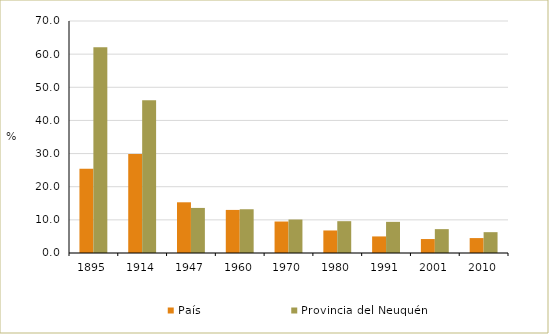
| Category | País | Provincia del Neuquén |
|---|---|---|
| 1895.0 | 25.4 | 62.1 |
| 1914.0 | 29.9 | 46.1 |
| 1947.0 | 15.3 | 13.6 |
| 1960.0 | 13 | 13.2 |
| 1970.0 | 9.5 | 10.1 |
| 1980.0 | 6.8 | 9.6 |
| 1991.0 | 5 | 9.4 |
| 2001.0 | 4.212 | 7.2 |
| 2010.0 | 4.502 | 6.286 |